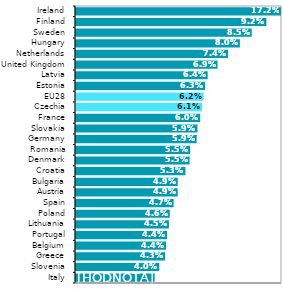
| Category | Series 0 |
|---|---|
| Italy | 0.038 |
| Slovenia | 0.04 |
| Greece | 0.043 |
| Belgium | 0.044 |
| Portugal | 0.044 |
| Lithuania | 0.045 |
| Poland | 0.046 |
| Spain | 0.047 |
| Austria | 0.049 |
| Bulgaria | 0.049 |
| Croatia | 0.053 |
| Denmark | 0.055 |
| Romania | 0.055 |
| Germany | 0.059 |
| Slovakia | 0.059 |
| France | 0.06 |
| Czechia | 0.061 |
| EU28 | 0.062 |
| Estonia | 0.063 |
| Latvia | 0.064 |
| United Kingdom | 0.069 |
| Netherlands | 0.074 |
| Hungary | 0.08 |
| Sweden | 0.085 |
| Finland | 0.092 |
| Ireland | 0.172 |